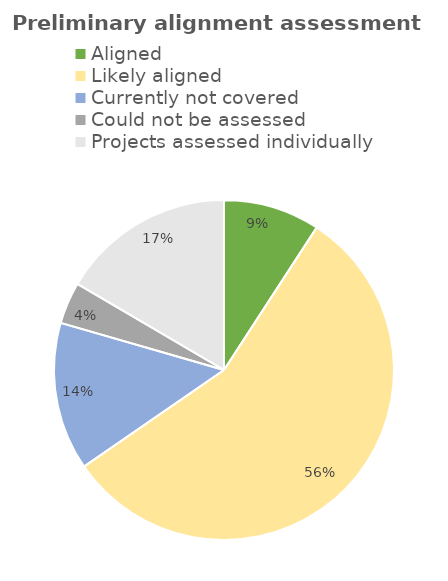
| Category | Series 0 |
|---|---|
| Aligned | 2396756.906 |
| Likely aligned | 14677981.55 |
| Currently not covered | 3677058.419 |
| Could not be assessed  | 1037189.916 |
| Projects assessed individually  | 4323237.294 |